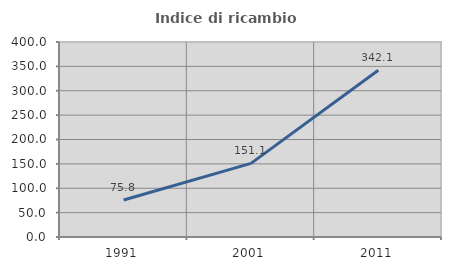
| Category | Indice di ricambio occupazionale  |
|---|---|
| 1991.0 | 75.834 |
| 2001.0 | 151.082 |
| 2011.0 | 342.144 |